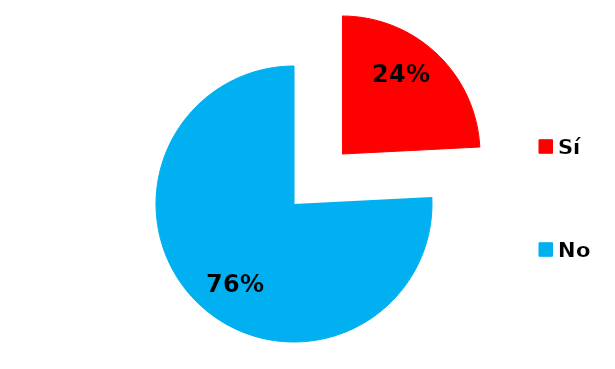
| Category | Series 0 |
|---|---|
| Sí | 60 |
| No | 188 |